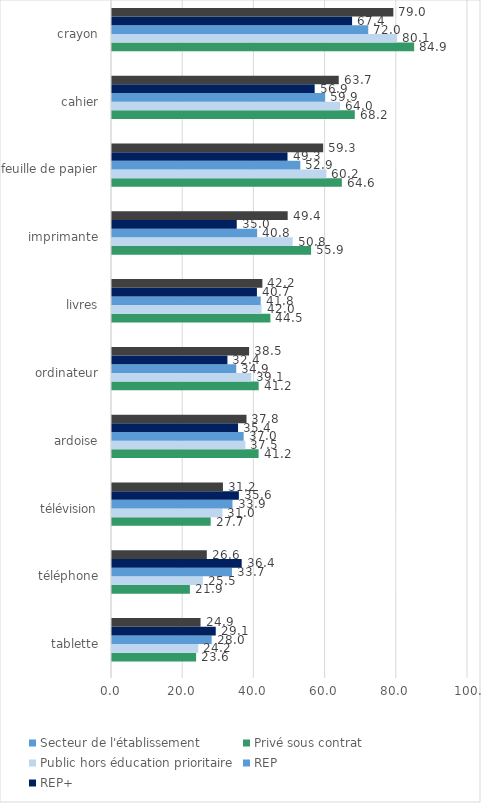
| Category | Secteur de l'établissement | Privé sous contrat | Public hors éducation prioritaire | REP | REP+ | Ensemble |
|---|---|---|---|---|---|---|
| tablette |  | 23.63 | 24.23 | 28 | 29.14 | 24.87 |
| téléphone |  | 21.88 | 25.53 | 33.7 | 36.43 | 26.63 |
| télévision |  | 27.72 | 31.01 | 33.85 | 35.64 | 31.17 |
| ardoise |  | 41.18 | 37.47 | 36.98 | 35.4 | 37.78 |
| ordinateur |  | 41.2 | 39.12 | 34.9 | 32.42 | 38.51 |
| livres |  | 44.49 | 42.03 | 41.77 | 40.71 | 42.24 |
| imprimante |  | 55.92 | 50.75 | 40.77 | 35.04 | 49.35 |
| feuille de papier |  | 64.57 | 60.24 | 52.89 | 49.3 | 59.32 |
| cahier |  | 68.2 | 64.04 | 59.87 | 56.93 | 63.69 |
| crayon |  | 84.87 | 80.08 | 71.98 | 67.44 | 79.03 |